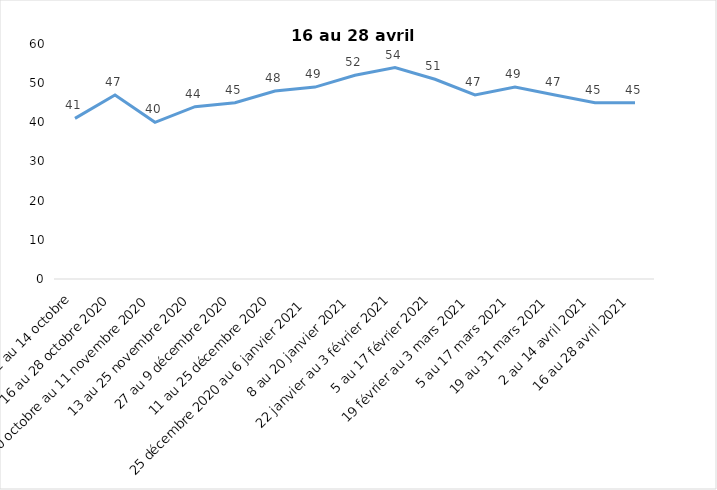
| Category | Toujours aux trois mesures |
|---|---|
| 2 au 14 octobre | 41 |
| 16 au 28 octobre 2020 | 47 |
| 30 octobre au 11 novembre 2020 | 40 |
| 13 au 25 novembre 2020 | 44 |
| 27 au 9 décembre 2020 | 45 |
| 11 au 25 décembre 2020 | 48 |
| 25 décembre 2020 au 6 janvier 2021 | 49 |
| 8 au 20 janvier 2021 | 52 |
| 22 janvier au 3 février 2021 | 54 |
| 5 au 17 février 2021 | 51 |
| 19 février au 3 mars 2021 | 47 |
| 5 au 17 mars 2021 | 49 |
| 19 au 31 mars 2021 | 47 |
| 2 au 14 avril 2021 | 45 |
| 16 au 28 avril 2021 | 45 |